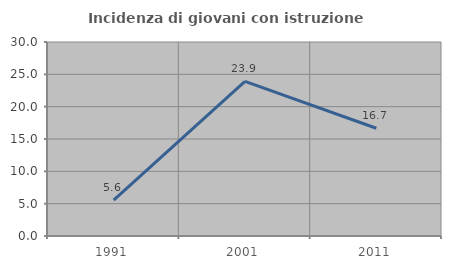
| Category | Incidenza di giovani con istruzione universitaria |
|---|---|
| 1991.0 | 5.556 |
| 2001.0 | 23.913 |
| 2011.0 | 16.667 |